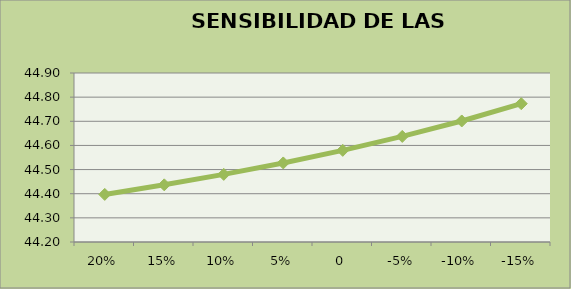
| Category | #¡REF! |
|---|---|
| 0.2 | 44.397 |
| 0.15 | 44.437 |
| 0.1 | 44.48 |
| 0.05 | 44.527 |
| 0.0 | 44.58 |
| -0.05 | 44.637 |
| -0.1 | 44.701 |
| -0.15 | 44.773 |